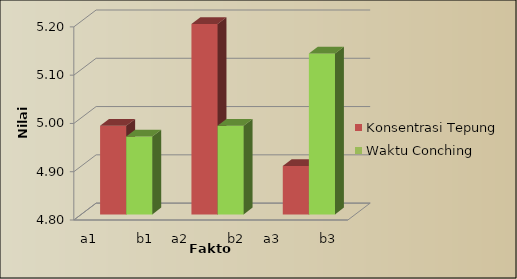
| Category | Konsentrasi Tepung | Waktu Conching |
|---|---|---|
| a1          b1 | 4.983 | 4.961 |
| a2          b2 | 5.194 | 4.983 |
| a3          b3 | 4.9 | 5.133 |